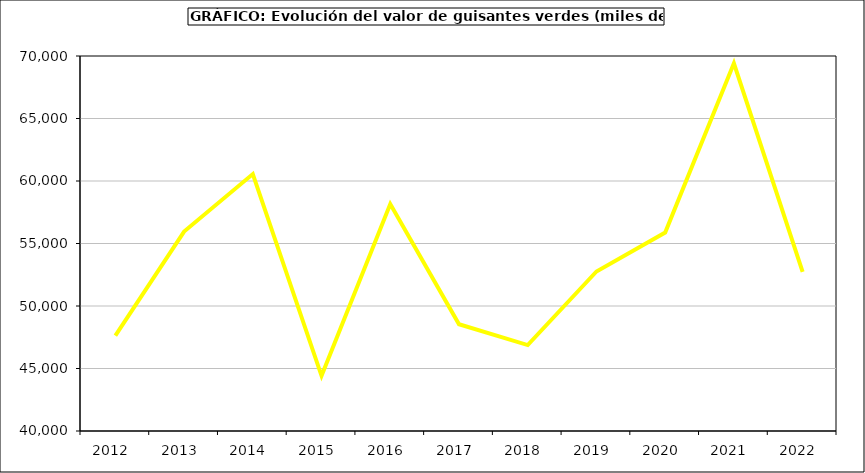
| Category | Valor |
|---|---|
| 2012.0 | 47635.04 |
| 2013.0 | 55957.374 |
| 2014.0 | 60552.887 |
| 2015.0 | 44411 |
| 2016.0 | 58153 |
| 2017.0 | 48537.691 |
| 2018.0 | 46876.83 |
| 2019.0 | 52761.852 |
| 2020.0 | 55876.725 |
| 2021.0 | 69416.881 |
| 2022.0 | 52723.453 |